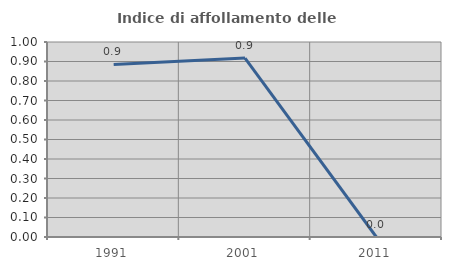
| Category | Indice di affollamento delle abitazioni  |
|---|---|
| 1991.0 | 0.885 |
| 2001.0 | 0.917 |
| 2011.0 | 0 |